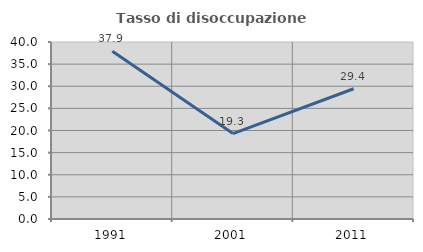
| Category | Tasso di disoccupazione giovanile  |
|---|---|
| 1991.0 | 37.907 |
| 2001.0 | 19.313 |
| 2011.0 | 29.441 |